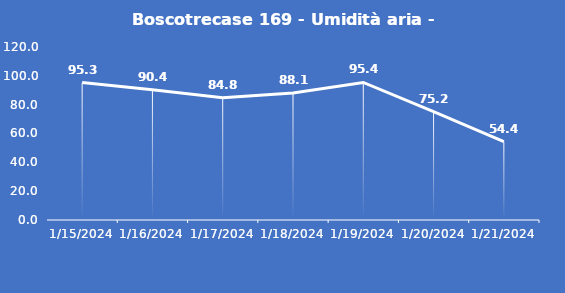
| Category | Boscotrecase 169 - Umidità aria - Grezzo (%) |
|---|---|
| 1/15/24 | 95.3 |
| 1/16/24 | 90.4 |
| 1/17/24 | 84.8 |
| 1/18/24 | 88.1 |
| 1/19/24 | 95.4 |
| 1/20/24 | 75.2 |
| 1/21/24 | 54.4 |